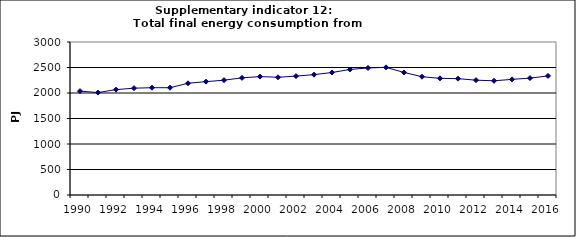
| Category | Total final energy consumption from transport, PJ |
|---|---|
| 1990 | 2036.25 |
| 1991 | 2008.534 |
| 1992 | 2066.395 |
| 1993 | 2094.405 |
| 1994 | 2103.993 |
| 1995 | 2103.365 |
| 1996 | 2190.592 |
| 1997 | 2222.459 |
| 1998 | 2251.326 |
| 1999 | 2296.589 |
| 2000 | 2322.046 |
| 2001 | 2308.488 |
| 2002 | 2331.413 |
| 2003 | 2359.923 |
| 2004 | 2402.141 |
| 2005 | 2461.552 |
| 2006 | 2491.207 |
| 2007 | 2502.489 |
| 2008 | 2402.943 |
| 2009 | 2319.216 |
| 2010 | 2287.498 |
| 2011 | 2281.518 |
| 2012 | 2251.513 |
| 2013 | 2239.507 |
| 2014 | 2266.977 |
| 2015 | 2292.233 |
| 2016 | 2334.861 |